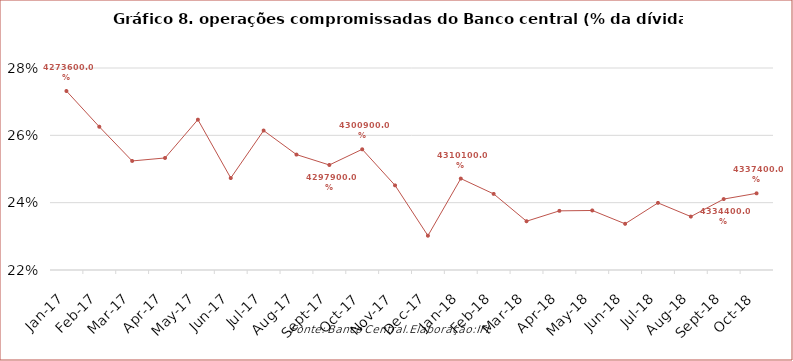
| Category | Operações compromissadas |
|---|---|
| 2017-01-01 | 0.273 |
| 2017-02-01 | 0.263 |
| 2017-03-01 | 0.252 |
| 2017-04-01 | 0.253 |
| 2017-05-01 | 0.265 |
| 2017-06-01 | 0.247 |
| 2017-07-01 | 0.261 |
| 2017-08-01 | 0.254 |
| 2017-09-01 | 0.251 |
| 2017-10-01 | 0.256 |
| 2017-11-01 | 0.245 |
| 2017-12-01 | 0.23 |
| 2018-01-01 | 0.247 |
| 2018-02-01 | 0.243 |
| 2018-03-01 | 0.234 |
| 2018-04-01 | 0.238 |
| 2018-05-01 | 0.238 |
| 2018-06-01 | 0.234 |
| 2018-07-01 | 0.24 |
| 2018-08-01 | 0.236 |
| 2018-09-01 | 0.241 |
| 2018-10-01 | 0.243 |